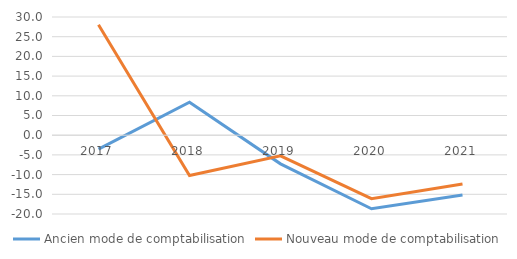
| Category | Ancien mode de comptabilisation | Nouveau mode de comptabilisation |
|---|---|---|
| 2017.0 | -3.52 | 28.056 |
| 2018.0 | 8.373 | -10.233 |
| 2019.0 | -7.266 | -5.254 |
| 2020.0 | -18.673 | -16.111 |
| 2021.0 | -15.157 | -12.362 |